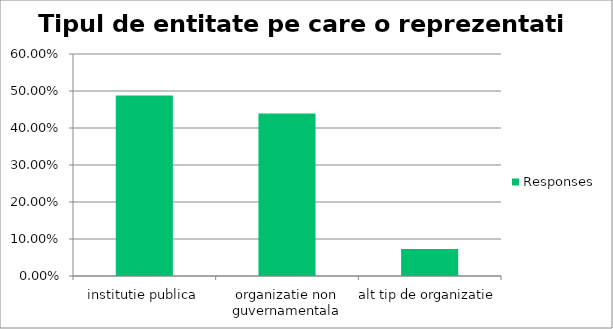
| Category | Responses |
|---|---|
| institutie publica | 0.488 |
| organizatie non guvernamentala | 0.439 |
| alt tip de organizatie | 0.073 |